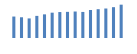
| Category | Exportações (1) |
|---|---|
| 0 | 595986.616 |
| 1 | 575965.577 |
| 2 | 544011.291 |
| 3 | 614380.205 |
| 4 | 656918.26 |
| 5 | 703504.835 |
| 6 | 720793.562 |
| 7 | 726284.803 |
| 8 | 735533.905 |
| 9 | 723973.625 |
| 10 | 778041 |
| 11 | 800341.537 |
| 12 | 819402.338 |
| 13 | 856189.676 |
| 14 | 925952.679 |